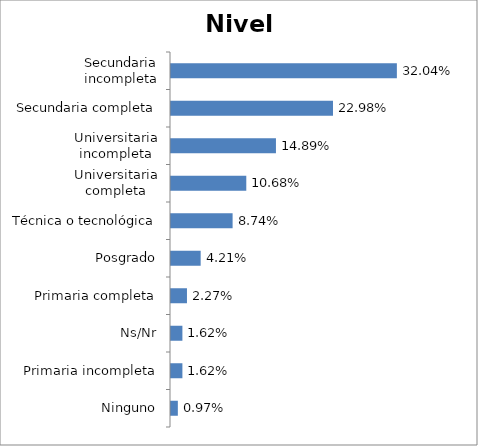
| Category | Total |
|---|---|
| Ninguno | 0.01 |
| Primaria incompleta | 0.016 |
| Ns/Nr | 0.016 |
| Primaria completa | 0.023 |
| Posgrado | 0.042 |
| Técnica o tecnológica | 0.087 |
| Universitaria completa | 0.107 |
| Universitaria incompleta | 0.149 |
| Secundaria completa | 0.23 |
| Secundaria incompleta | 0.32 |